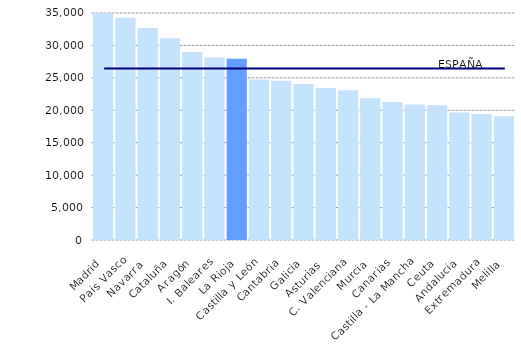
| Category | Series 1 |
|---|---|
| Madrid | 35876 |
| País Vasco | 34273 |
| Navarra  | 32692 |
| Cataluña | 31110 |
| Aragón | 28993 |
| I. Baleares | 28143 |
| La Rioja | 27942 |
| Castilla y León | 24758 |
| Cantabria | 24556 |
| Galicia | 24034 |
| Asturias  | 23455 |
| C. Valenciana | 23094 |
| Murcia | 21853 |
| Canarias | 21265 |
| Castilla - La Mancha | 20876 |
| Ceuta | 20781 |
| Andalucía | 19658 |
| Extremadura | 19432 |
| Melilla | 19073 |